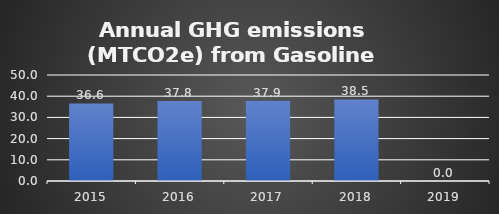
| Category | Series 0 |
|---|---|
| 0 | 36.568 |
| 1 | 37.787 |
| 2 | 37.907 |
| 3 | 38.46 |
| 4 | 0 |